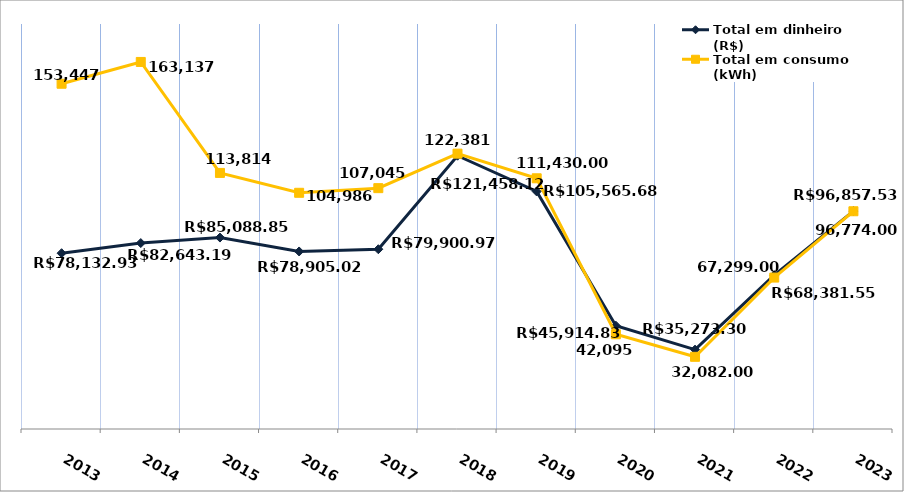
| Category | Total em dinheiro (R$) |
|---|---|
| 2013.0 | 78132.93 |
| 2014.0 | 82643.19 |
| 2015.0 | 85088.85 |
| 2016.0 | 78905.02 |
| 2017.0 | 79900.97 |
| 2018.0 | 121458.12 |
| 2019.0 | 105565.68 |
| 2020.0 | 45914.83 |
| 2021.0 | 35273.3 |
| 2022.0 | 68381.55 |
| 2023.0 | 96857.53 |